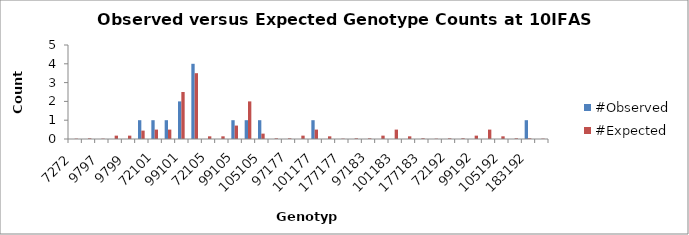
| Category | #Observed | #Expected |
|---|---|---|
| 7272.0 | 0 | 0.018 |
| 7297.0 | 0 | 0.036 |
| 9797.0 | 0 | 0.018 |
| 7299.0 | 0 | 0.179 |
| 9799.0 | 0 | 0.179 |
| 9999.0 | 1 | 0.446 |
| 72101.0 | 1 | 0.5 |
| 97101.0 | 1 | 0.5 |
| 99101.0 | 2 | 2.5 |
| 101101.0 | 4 | 3.5 |
| 72105.0 | 0 | 0.143 |
| 97105.0 | 0 | 0.143 |
| 99105.0 | 1 | 0.714 |
| 101105.0 | 1 | 2 |
| 105105.0 | 1 | 0.286 |
| 72177.0 | 0 | 0.036 |
| 97177.0 | 0 | 0.036 |
| 99177.0 | 0 | 0.179 |
| 101177.0 | 1 | 0.5 |
| 105177.0 | 0 | 0.143 |
| 177177.0 | 0 | 0.018 |
| 72183.0 | 0 | 0.036 |
| 97183.0 | 0 | 0.036 |
| 99183.0 | 0 | 0.179 |
| 101183.0 | 0 | 0.5 |
| 105183.0 | 0 | 0.143 |
| 177183.0 | 0 | 0.036 |
| 183183.0 | 0 | 0.018 |
| 72192.0 | 0 | 0.036 |
| 97192.0 | 0 | 0.036 |
| 99192.0 | 0 | 0.179 |
| 101192.0 | 0 | 0.5 |
| 105192.0 | 0 | 0.143 |
| 177192.0 | 0 | 0.036 |
| 183192.0 | 1 | 0.036 |
| 192192.0 | 0 | 0.018 |